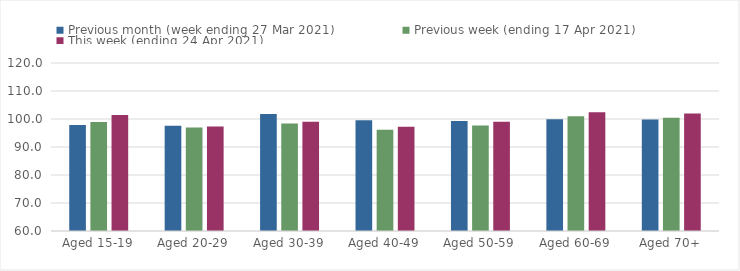
| Category | Previous month (week ending 27 Mar 2021) | Previous week (ending 17 Apr 2021) | This week (ending 24 Apr 2021) |
|---|---|---|---|
| Aged 15-19 | 97.86 | 98.97 | 101.46 |
| Aged 20-29 | 97.59 | 96.94 | 97.34 |
| Aged 30-39 | 101.83 | 98.43 | 99.05 |
| Aged 40-49 | 99.52 | 96.12 | 97.19 |
| Aged 50-59 | 99.28 | 97.69 | 99.05 |
| Aged 60-69 | 99.93 | 100.99 | 102.44 |
| Aged 70+ | 99.83 | 100.47 | 101.93 |